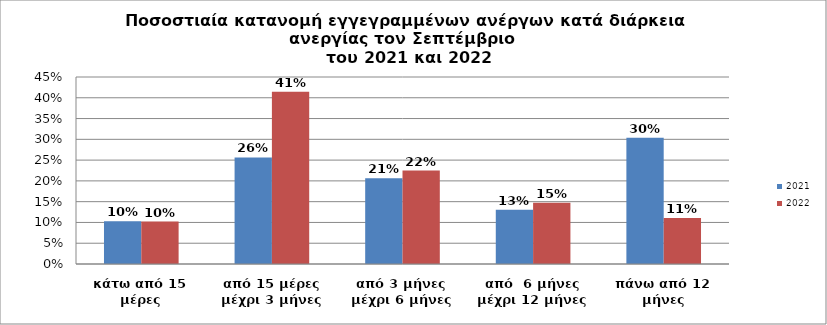
| Category | 2021 | 2022 |
|---|---|---|
| κάτω από 15 μέρες | 0.103 | 0.102 |
| από 15 μέρες μέχρι 3 μήνες | 0.256 | 0.415 |
| από 3 μήνες μέχρι 6 μήνες | 0.206 | 0.225 |
| από  6 μήνες μέχρι 12 μήνες | 0.13 | 0.148 |
| πάνω από 12 μήνες | 0.304 | 0.111 |